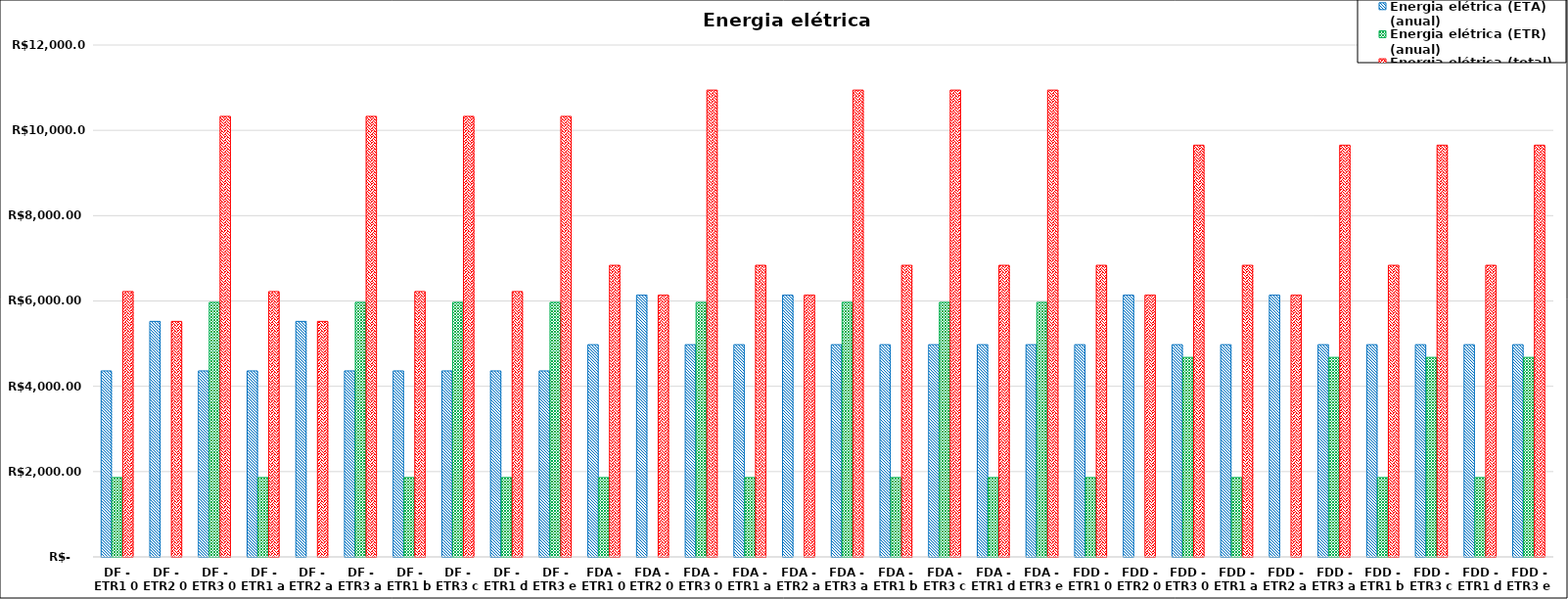
| Category | Energia elétrica (ETA) (anual) | Energia elétrica (ETR) (anual) | Energia elétrica (total) (anual) |
|---|---|---|---|
| DF - ETR1 0 | 4359.849 | 1860.701 | 6220.549 |
| DF - ETR2 0 | 5521.051 | 0 | 5521.051 |
| DF - ETR3 0 | 4359.835 | 5967.36 | 10327.195 |
| DF - ETR1 a | 4359.849 | 1860.701 | 6220.549 |
| DF - ETR2 a | 5521.051 | 0 | 5521.051 |
| DF - ETR3 a | 4359.835 | 5967.36 | 10327.195 |
| DF - ETR1 b | 4359.849 | 1860.701 | 6220.549 |
| DF - ETR3 c | 4359.835 | 5967.36 | 10327.195 |
| DF - ETR1 d | 4359.849 | 1860.701 | 6220.549 |
| DF - ETR3 e | 4359.835 | 5967.36 | 10327.195 |
| FDA - ETR1 0 | 4975.219 | 1860.701 | 6835.92 |
| FDA - ETR2 0 | 6136.435 | 0 | 6136.435 |
| FDA - ETR3 0 | 4975.219 | 5967.36 | 10942.579 |
| FDA - ETR1 a | 4975.219 | 1860.701 | 6835.92 |
| FDA - ETR2 a | 6136.435 | 0 | 6136.435 |
| FDA - ETR3 a | 4975.219 | 5967.36 | 10942.579 |
| FDA - ETR1 b | 4975.219 | 1860.701 | 6835.92 |
| FDA - ETR3 c | 4975.219 | 5967.36 | 10942.579 |
| FDA - ETR1 d | 4975.219 | 1860.701 | 6835.92 |
| FDA - ETR3 e | 4975.219 | 5967.36 | 10942.579 |
| FDD - ETR1 0 | 4975.186 | 1860.701 | 6835.886 |
| FDD - ETR2 0 | 6136.402 | 0 | 6136.402 |
| FDD - ETR3 0 | 4975.186 | 4677.12 | 9652.306 |
| FDD - ETR1 a | 4975.186 | 1860.701 | 6835.886 |
| FDD - ETR2 a | 6136.402 | 0 | 6136.402 |
| FDD - ETR3 a | 4975.186 | 4677.12 | 9652.306 |
| FDD - ETR1 b | 4975.186 | 1860.701 | 6835.886 |
| FDD - ETR3 c | 4975.186 | 4677.12 | 9652.306 |
| FDD - ETR1 d | 4975.186 | 1860.701 | 6835.886 |
| FDD - ETR3 e | 4975.186 | 4677.12 | 9652.306 |